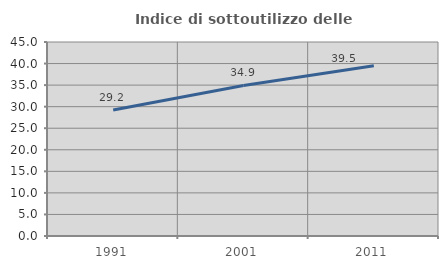
| Category | Indice di sottoutilizzo delle abitazioni  |
|---|---|
| 1991.0 | 29.21 |
| 2001.0 | 34.932 |
| 2011.0 | 39.508 |